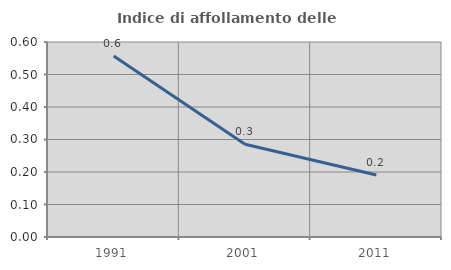
| Category | Indice di affollamento delle abitazioni  |
|---|---|
| 1991.0 | 0.557 |
| 2001.0 | 0.285 |
| 2011.0 | 0.191 |